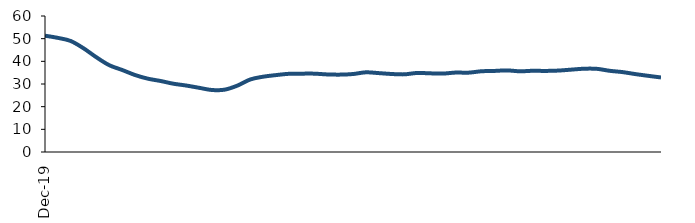
| Category | Series 0 |
|---|---|
| 2019-12-01 | 51.311 |
| 2020-01-01 | 50.348 |
| 2020-02-01 | 48.978 |
| 2020-03-01 | 45.766 |
| 2020-04-01 | 41.808 |
| 2020-05-01 | 38.31 |
| 2020-06-01 | 36.214 |
| 2020-07-01 | 33.993 |
| 2020-08-01 | 32.365 |
| 2020-09-01 | 31.338 |
| 2020-10-01 | 30.13 |
| 2020-11-01 | 29.326 |
| 2020-12-01 | 28.333 |
| 2021-01-01 | 27.356 |
| 2021-02-01 | 27.502 |
| 2021-03-01 | 29.312 |
| 2021-04-01 | 32.007 |
| 2021-05-01 | 33.224 |
| 2021-06-01 | 33.927 |
| 2021-07-01 | 34.496 |
| 2021-08-01 | 34.565 |
| 2021-09-01 | 34.562 |
| 2021-10-01 | 34.221 |
| 2021-11-01 | 34.137 |
| 2021-12-01 | 34.397 |
| 2022-01-01 | 35.154 |
| 2022-02-01 | 34.808 |
| 2022-03-01 | 34.415 |
| 2022-04-01 | 34.261 |
| 2022-05-01 | 34.87 |
| 2022-06-01 | 34.705 |
| 2022-07-01 | 34.592 |
| 2022-08-01 | 35.045 |
| 2022-09-01 | 35.003 |
| 2022-10-01 | 35.616 |
| 2022-11-01 | 35.763 |
| 2022-12-01 | 36.005 |
| 2023-01-01 | 35.604 |
| 2023-02-01 | 35.827 |
| 2023-03-01 | 35.769 |
| 2023-04-01 | 35.924 |
| 2023-05-01 | 36.331 |
| 2023-06-01 | 36.74 |
| 2023-07-01 | 36.693 |
| 2023-08-01 | 35.824 |
| 2023-09-01 | 35.253 |
| 2023-10-01 | 34.375 |
| 2023-11-01 | 33.606 |
| 2023-12-01 | 32.893 |